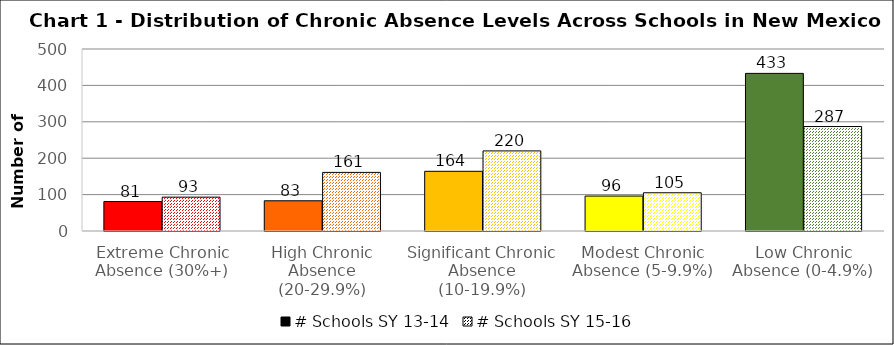
| Category | # Schools SY 13-14 | # Schools SY 15-16 |
|---|---|---|
| Extreme Chronic Absence (30%+) | 81 | 93 |
| High Chronic Absence (20-29.9%) | 83 | 161 |
| Significant Chronic Absence (10-19.9%) | 164 | 220 |
| Modest Chronic Absence (5-9.9%) | 96 | 105 |
| Low Chronic Absence (0-4.9%) | 433 | 287 |